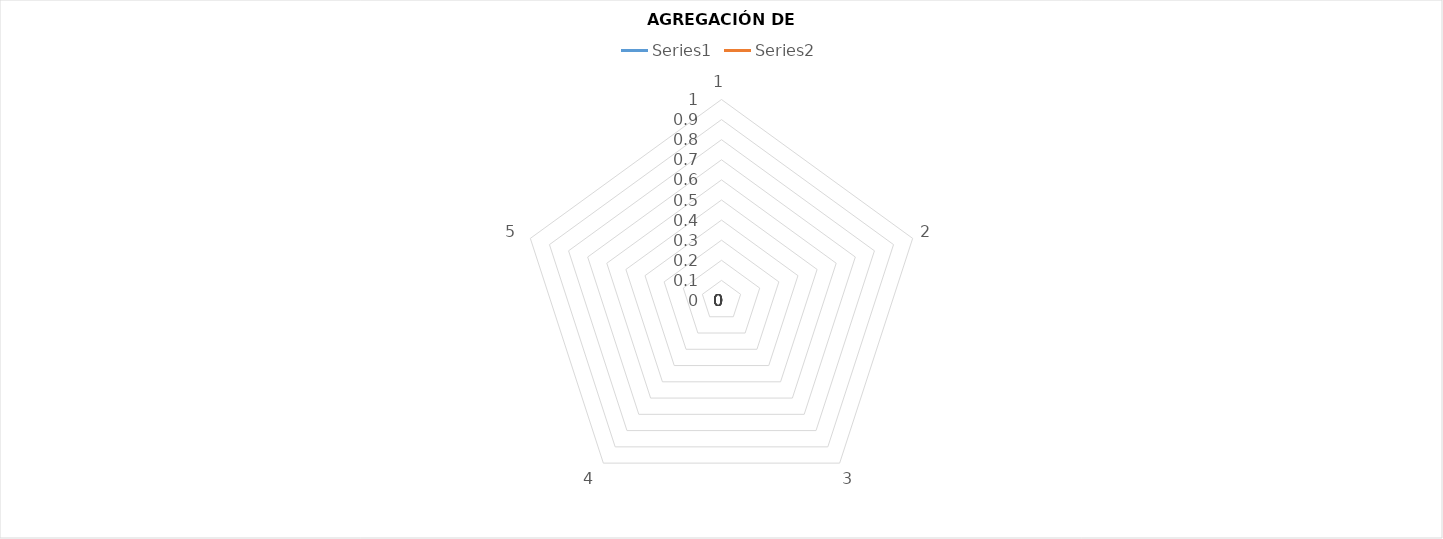
| Category | Series 0 | Series 1 |
|---|---|---|
| 0 | 6 | 0 |
| 1 | 6 | 0 |
| 2 | 6 | 0 |
| 3 | 6 | 0 |
| 4 | 6 | 0 |